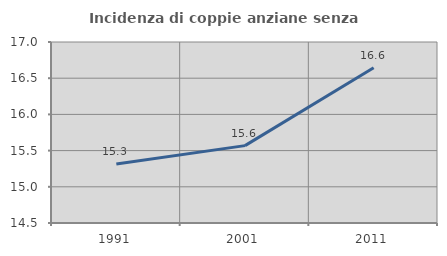
| Category | Incidenza di coppie anziane senza figli  |
|---|---|
| 1991.0 | 15.315 |
| 2001.0 | 15.569 |
| 2011.0 | 16.645 |